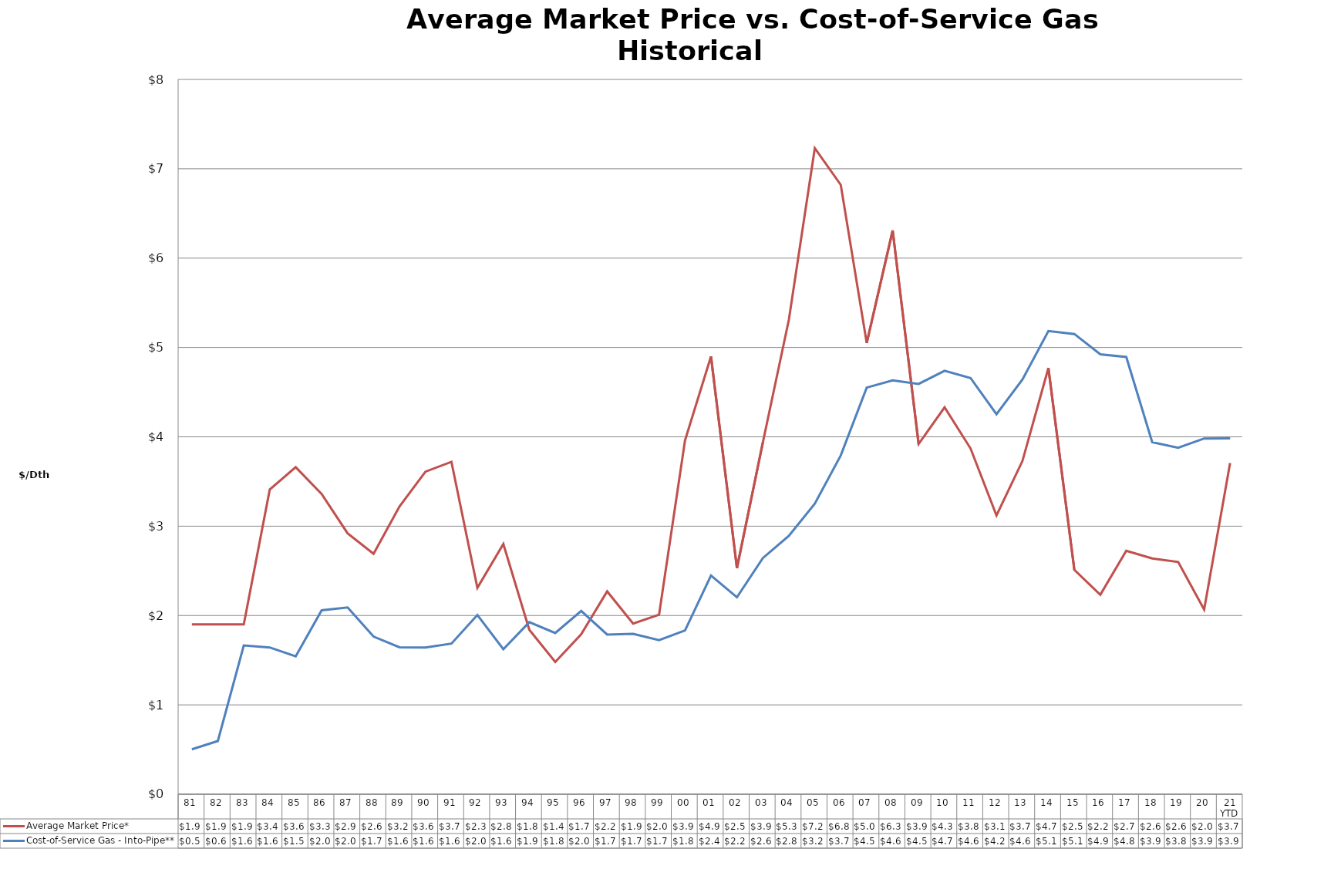
| Category | Average Market Price* | Cost-of-Service Gas - Into-Pipe** |
|---|---|---|
| 81 | 1.9 | 0.502 |
| 82 | 1.9 | 0.596 |
| 83 | 1.9 | 1.665 |
| 84 | 3.41 | 1.643 |
| 85 | 3.66 | 1.543 |
| 86 | 3.36 | 2.059 |
| 87 | 2.92 | 2.091 |
| 88 | 2.69 | 1.764 |
| 89 | 3.22 | 1.644 |
| 90 | 3.61 | 1.642 |
| 91 | 3.72 | 1.685 |
| 92 | 2.31 | 2.005 |
| 93 | 2.8 | 1.623 |
| 94 | 1.84 | 1.926 |
| 95 | 1.48 | 1.804 |
| 96 | 1.79 | 2.052 |
| 97 | 2.27 | 1.787 |
| 98 | 1.91 | 1.795 |
| 99 | 2.01 | 1.725 |
| 00 | 3.96 | 1.833 |
| 01 | 4.9 | 2.448 |
| 02 | 2.53 | 2.204 |
| 03 | 3.94 | 2.644 |
| 04 | 5.31 | 2.891 |
| 05 | 7.23 | 3.251 |
| 06 | 6.82 | 3.792 |
| 07 | 5.05 | 4.551 |
| 08 | 6.31 | 4.632 |
| 09 | 3.92 | 4.592 |
| 10 | 4.33 | 4.74 |
| 11 | 3.87 | 4.658 |
| 12 | 3.12 | 4.253 |
| 13 | 3.73 | 4.641 |
| 14 | 4.77 | 5.184 |
| 15 | 2.51 | 5.151 |
| 16 | 2.233 | 4.923 |
| 17 | 2.725 | 4.894 |
| 18 | 2.639 | 3.94 |
| 19 | 2.599 | 3.877 |
| 20 | 2.067 | 3.981 |
| 21 YTD | 3.706 | 3.983 |